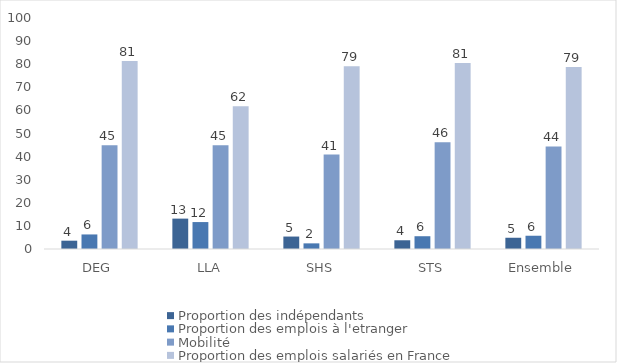
| Category | Proportion des indépendants | Proportion des emplois à l'etranger | Mobilité | Proportion des emplois salariés en France |
|---|---|---|---|---|
| DEG | 3.6 | 6.3 | 44.88 | 81.36 |
| LLA | 13.15 | 11.66 | 44.92 | 61.81 |
| SHS | 5.39 | 2.44 | 40.9 | 79.12 |
| STS | 3.78 | 5.53 | 46.19 | 80.52 |
| Ensemble | 4.87 | 5.74 | 44.42 | 78.78 |